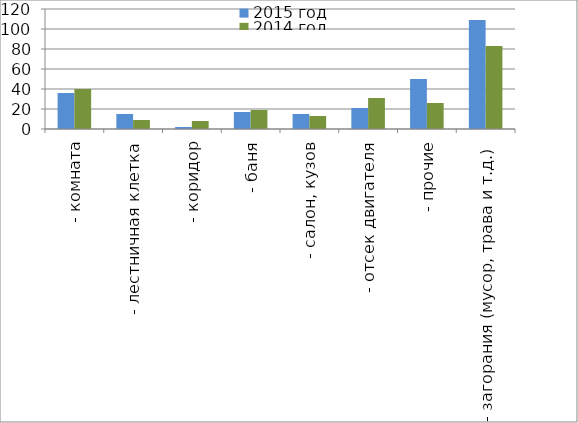
| Category | 2015 год | 2014 год |
|---|---|---|
|  - комната | 36 | 40 |
|  - лестничная клетка | 15 | 9 |
|  - коридор | 2 | 8 |
|  - баня | 17 | 19 |
|  - салон, кузов | 15 | 13 |
|  - отсек двигателя | 21 | 31 |
| - прочие | 50 | 26 |
| - загорания (мусор, трава и т.д.)  | 109 | 83 |